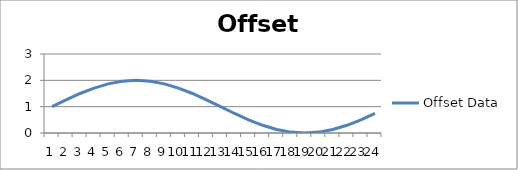
| Category | Offset Data |
|---|---|
| 0 | 1 |
| 1 | 1.259 |
| 2 | 1.5 |
| 3 | 1.707 |
| 4 | 1.866 |
| 5 | 1.966 |
| 6 | 2 |
| 7 | 1.966 |
| 8 | 1.866 |
| 9 | 1.707 |
| 10 | 1.5 |
| 11 | 1.259 |
| 12 | 1 |
| 13 | 0.741 |
| 14 | 0.5 |
| 15 | 0.293 |
| 16 | 0.134 |
| 17 | 0.034 |
| 18 | 0 |
| 19 | 0.034 |
| 20 | 0.134 |
| 21 | 0.293 |
| 22 | 0.5 |
| 23 | 0.741 |